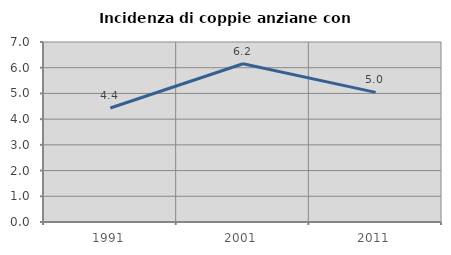
| Category | Incidenza di coppie anziane con figli |
|---|---|
| 1991.0 | 4.433 |
| 2001.0 | 6.154 |
| 2011.0 | 5.042 |